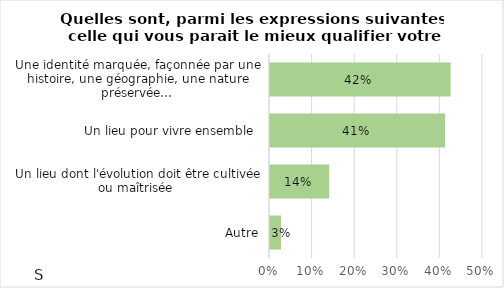
| Category | Series 0 |
|---|---|
| Autre | 0.026 |
| Un lieu dont l'évolution doit être cultivée ou maîtrisée  | 0.139 |
| Un lieu pour vivre ensemble  | 0.411 |
| Une identité marquée, façonnée par une histoire, une géographie, une nature préservée… | 0.424 |